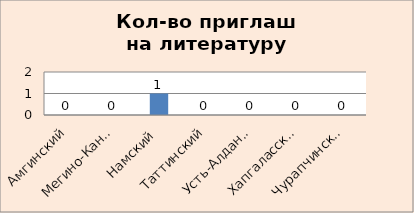
| Category | Series 0 |
|---|---|
| Амгинский | 0 |
| Мегино-Кангаласский | 0 |
| Намский | 1 |
| Таттинский | 0 |
| Усть-Алданский | 0 |
| Хапгаласский | 0 |
| Чурапчинский | 0 |